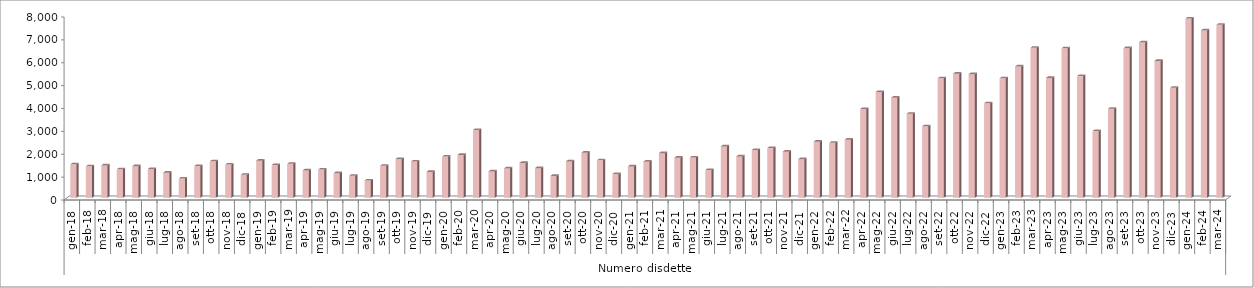
| Category | Series 0 |
|---|---|
| 0 | 1463 |
| 1900-01-01 | 1374 |
| 1900-01-02 | 1415 |
| 1900-01-03 | 1245 |
| 1900-01-04 | 1382 |
| 1900-01-05 | 1258 |
| 1900-01-06 | 1099 |
| 1900-01-07 | 843 |
| 1900-01-08 | 1388 |
| 1900-01-09 | 1594 |
| 1900-01-10 | 1454 |
| 1900-01-11 | 1005 |
| 1900-01-12 | 1625 |
| 1900-01-13 | 1430 |
| 1900-01-14 | 1484 |
| 1900-01-15 | 1196 |
| 1900-01-16 | 1232 |
| 1900-01-17 | 1076 |
| 1900-01-18 | 963 |
| 1900-01-19 | 755 |
| 1900-01-20 | 1400 |
| 1900-01-21 | 1697 |
| 1900-01-22 | 1587 |
| 1900-01-23 | 1131 |
| 1900-01-24 | 1801 |
| 1900-01-25 | 1874 |
| 1900-01-26 | 2963 |
| 1900-01-27 | 1154 |
| 1900-01-28 | 1282 |
| 1900-01-29 | 1525 |
| 1900-01-30 | 1297 |
| 1900-01-31 | 955 |
| 1900-02-01 | 1592 |
| 1900-02-02 | 1971 |
| 1900-02-03 | 1637 |
| 1900-02-04 | 1038 |
| 1900-02-05 | 1373 |
| 1900-02-06 | 1579 |
| 1900-02-07 | 1951 |
| 1900-02-08 | 1754 |
| 1900-02-09 | 1762 |
| 1900-02-10 | 1212 |
| 1900-02-11 | 2248 |
| 1900-02-12 | 1811 |
| 1900-02-13 | 2089 |
| 1900-02-14 | 2173 |
| 1900-02-15 | 2017 |
| 1900-02-16 | 1690 |
| 1900-02-17 | 2455 |
| 1900-02-18 | 2403 |
| 1900-02-19 | 2539 |
| 1900-02-20 | 3881 |
| 1900-02-21 | 4626 |
| 1900-02-22 | 4376 |
| 1900-02-23 | 3675 |
| 1900-02-24 | 3129 |
| 1900-02-25 | 5225 |
| 1900-02-26 | 5426 |
| 1900-02-27 | 5403 |
| 1900-02-28 | 4132 |
| 1900-02-28 | 5222 |
| 1900-03-01 | 5742 |
| 1900-03-02 | 6560 |
| 1900-03-03 | 5242 |
| 1900-03-04 | 6534 |
| 1900-03-05 | 5320 |
| 1900-03-06 | 2917 |
| 1900-03-07 | 3894 |
| 1900-03-08 | 6540 |
| 1900-03-09 | 6792 |
| 1900-03-10 | 5985 |
| 1900-03-11 | 4809 |
| 1900-03-12 | 7834 |
| 1900-03-13 | 7318 |
| 1900-03-14 | 7564 |